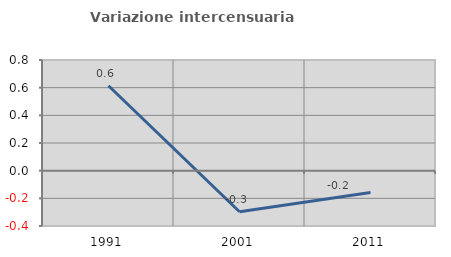
| Category | Variazione intercensuaria annua |
|---|---|
| 1991.0 | 0.614 |
| 2001.0 | -0.297 |
| 2011.0 | -0.157 |